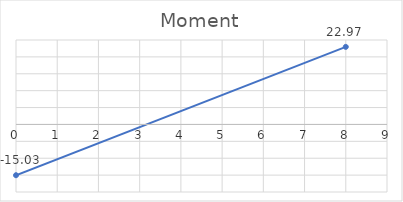
| Category | Series 0 |
|---|---|
| 0.0 | -15.034 |
| 8.0 | 22.966 |